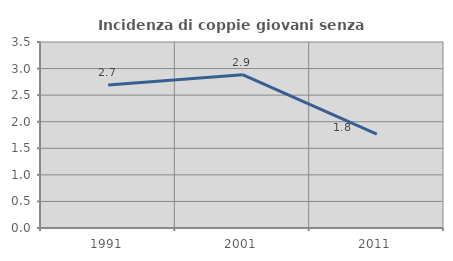
| Category | Incidenza di coppie giovani senza figli |
|---|---|
| 1991.0 | 2.691 |
| 2001.0 | 2.885 |
| 2011.0 | 1.765 |